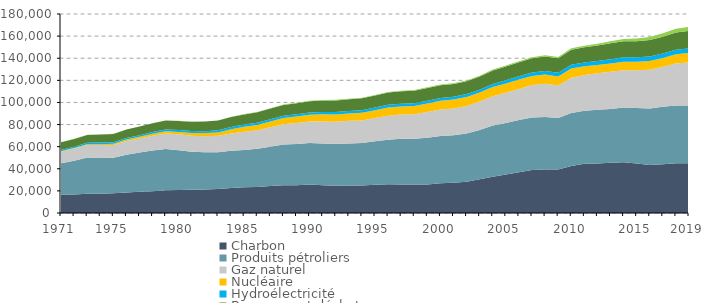
| Category | Charbon | Produits pétroliers | Gaz naturel | Nucléaire | Hydroélectricité | Biomasse et déchets | Autres (géothermie, solaire, éolien, …) |
|---|---|---|---|---|---|---|---|
| 1971 | 16715.582 | 28347.422 | 10384.864 | 336.627 | 1204.604 | 6894.597 | 50.637 |
|  | 16825.502 | 30464.492 | 10953.117 | 462.045 | 1267.379 | 7029.735 | 57.123 |
|  | 17400.701 | 32778.324 | 11358.985 | 616.857 | 1282.646 | 7165.568 | 69.364 |
|  | 17469.503 | 32324.603 | 11665.363 | 827.015 | 1421.984 | 7311.936 | 73.214 |
| 1975 | 17838.545 | 32044.938 | 11618.266 | 1159.502 | 1445.138 | 7427.085 | 79.771 |
|  | 18574.533 | 34215.273 | 12303.776 | 1327.24 | 1433.297 | 7593.97 | 91.332 |
|  | 19127.072 | 35582.563 | 12587.424 | 1616.54 | 1481.175 | 7751.525 | 92.294 |
|  | 19686.801 | 36920.183 | 13163.252 | 1889.672 | 1601.017 | 7916.676 | 93.002 |
|  | 20486.41 | 37388.971 | 13999.646 | 1960.266 | 1685.489 | 8091.71 | 119.432 |
| 1980 | 20733.777 | 36115.721 | 14320.736 | 2155.048 | 1716.86 | 8257.058 | 152.905 |
|  | 20955.55 | 34521.165 | 14429.435 | 2542.826 | 1758.093 | 8405.713 | 164.293 |
|  | 21243.252 | 33780.879 | 14481.739 | 2748.543 | 1798.345 | 8608.142 | 169.004 |
|  | 21708.423 | 33306.564 | 14749.503 | 3122.775 | 1878.706 | 8795.435 | 192.867 |
|  | 22519.947 | 33698.676 | 15803.447 | 3789.333 | 1941.906 | 9092.948 | 216.969 |
| 1985 | 23332.557 | 33762.64 | 16390.025 | 4502.59 | 1973.191 | 9245.742 | 244.907 |
|  | 23514.806 | 34658.678 | 16643.347 | 4837.092 | 2008.426 | 9385.762 | 274.22 |
|  | 24427.369 | 35530.327 | 17569.238 | 5250.121 | 2014.569 | 9642.268 | 303.568 |
|  | 25170.289 | 36686.018 | 18322.077 | 5703.725 | 2083.599 | 9761.903 | 313.127 |
|  | 25132.846 | 37280.777 | 19063.395 | 5854.008 | 2071.673 | 9927.778 | 375.035 |
| 1990 | 25822.946 | 37590.713 | 19332.641 | 6111.798 | 2139.967 | 10191.255 | 429.823 |
|  | 25126.536 | 37737.608 | 19995.041 | 6392.971 | 2206.382 | 10362.711 | 435.817 |
|  | 24680.5 | 37949.311 | 20012.807 | 6444.627 | 2206.853 | 10573.265 | 462.628 |
|  | 24775.734 | 38181.01 | 20377.979 | 6645.17 | 2335.166 | 10604.561 | 461.755 |
|  | 24986.645 | 38420.543 | 20370.344 | 6801.423 | 2356.079 | 10753.092 | 492.127 |
| 1995 | 25651.57 | 39205.24 | 20970.876 | 7072.183 | 2474.461 | 10943.822 | 498.503 |
|  | 26072.644 | 40224.76 | 21716.966 | 7331.16 | 2506.804 | 11117.671 | 549.723 |
|  | 25870.617 | 41237.229 | 21955.838 | 7257.555 | 2537.569 | 11231.322 | 555.121 |
|  | 25779.2 | 41402.172 | 22151.478 | 7414.928 | 2550 | 11332.488 | 589.365 |
|  | 25886.895 | 42288.082 | 23149.576 | 7675.578 | 2560.055 | 11484.977 | 643.818 |
| 2000 | 26910.091 | 42665.274 | 24041.769 | 7855.683 | 2612.82 | 11525.023 | 720.563 |
|  | 27320.201 | 43069.644 | 24201.245 | 7999.09 | 2556.583 | 11455.793 | 734.866 |
|  | 28276.609 | 43582.045 | 24973.885 | 8069.03 | 2628.482 | 11658.928 | 709.665 |
|  | 30431.17 | 44548.952 | 25910.786 | 7992.04 | 2642.295 | 11907.759 | 737.426 |
|  | 32861.318 | 46188.113 | 26619.05 | 8303.383 | 2810.356 | 12153.054 | 789.789 |
| 2005 | 34784.471 | 46655.38 | 27400.014 | 8393.436 | 2934.47 | 12406.634 | 824.641 |
|  | 36878.208 | 47238.013 | 28071.392 | 8465.226 | 3039.607 | 12700.975 | 883.471 |
|  | 38832.813 | 47634.073 | 29290.714 | 8248.121 | 3082.087 | 12929.75 | 971.311 |
|  | 39357.096 | 47499.689 | 30075.904 | 8289.778 | 3207.542 | 13171.107 | 1052.047 |
|  | 39328.998 | 46543.828 | 29461.243 | 8176.961 | 3265.152 | 13225.715 | 1178.995 |
| 2010 | 42497.911 | 47983.353 | 31791.043 | 8358.629 | 3448.585 | 13645.367 | 1294.783 |
|  | 44473.248 | 48010 | 32365.535 | 7832.431 | 3509.997 | 13670.782 | 1485.038 |
|  | 44843.296 | 48498.501 | 32993.939 | 7462.015 | 3674.796 | 14057.06 | 1662.828 |
|  | 45398.729 | 48695.251 | 33675.517 | 7519.806 | 3806.244 | 14381.023 | 1950.488 |
|  | 45966.855 | 49562.111 | 33687.79 | 7690.779 | 3887.851 | 14523.682 | 2166.929 |
| 2015 | 44715.639 | 50351.495 | 34027.438 | 7795.358 | 3893.867 | 14672.783 | 2410.75 |
|  | 43366.088 | 51114.438 | 35174.635 | 7911.543 | 4031.933 | 14847.008 | 2672.96 |
|  | 44099.818 | 52036.987 | 36088.642 | 7995.415 | 4074.538 | 15172.934 | 3042.534 |
|  | 45090.986 | 52053.369 | 38125.684 | 8216.942 | 4201.93 | 15469.832 | 3419.739 |
| 2019 | 45104.37 | 52045.778 | 39106.772 | 8461.436 | 4220.733 | 15781.447 | 3748.788 |